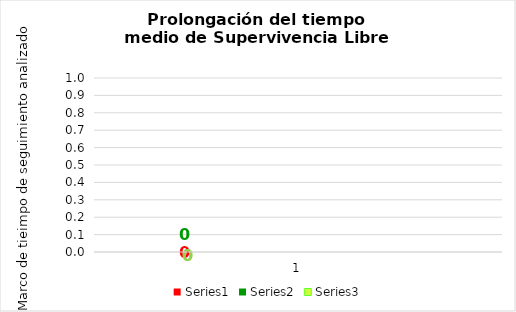
| Category | Series 0 | Series 1 | Series 2 |
|---|---|---|---|
| 0 | 39.258 | 8.634 | 1392.108 |